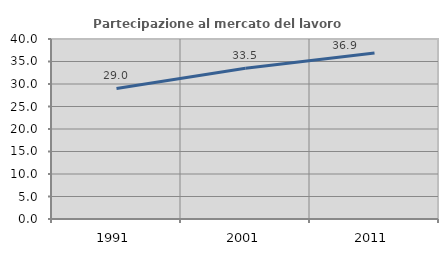
| Category | Partecipazione al mercato del lavoro  femminile |
|---|---|
| 1991.0 | 29.008 |
| 2001.0 | 33.496 |
| 2011.0 | 36.896 |